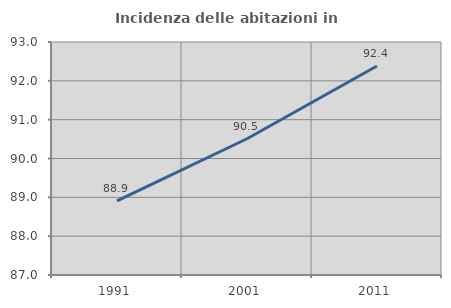
| Category | Incidenza delle abitazioni in proprietà  |
|---|---|
| 1991.0 | 88.909 |
| 2001.0 | 90.508 |
| 2011.0 | 92.382 |